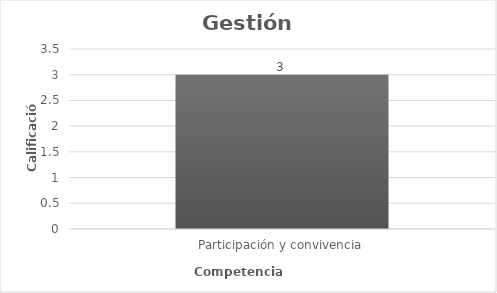
| Category | Series 0 |
|---|---|
| Participación y convivencia | 3 |